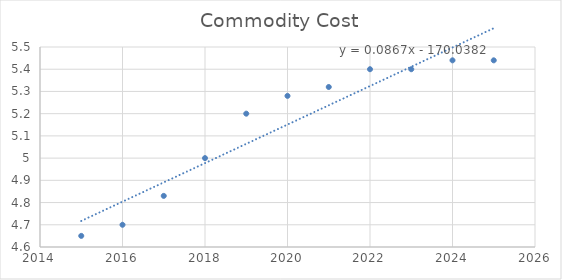
| Category | Series 0 |
|---|---|
| 2015.0 | 4.65 |
| 2016.0 | 4.7 |
| 2017.0 | 4.83 |
| 2018.0 | 5 |
| 2019.0 | 5.2 |
| 2020.0 | 5.28 |
| 2021.0 | 5.32 |
| 2022.0 | 5.4 |
| 2023.0 | 5.4 |
| 2024.0 | 5.44 |
| 2025.0 | 5.44 |